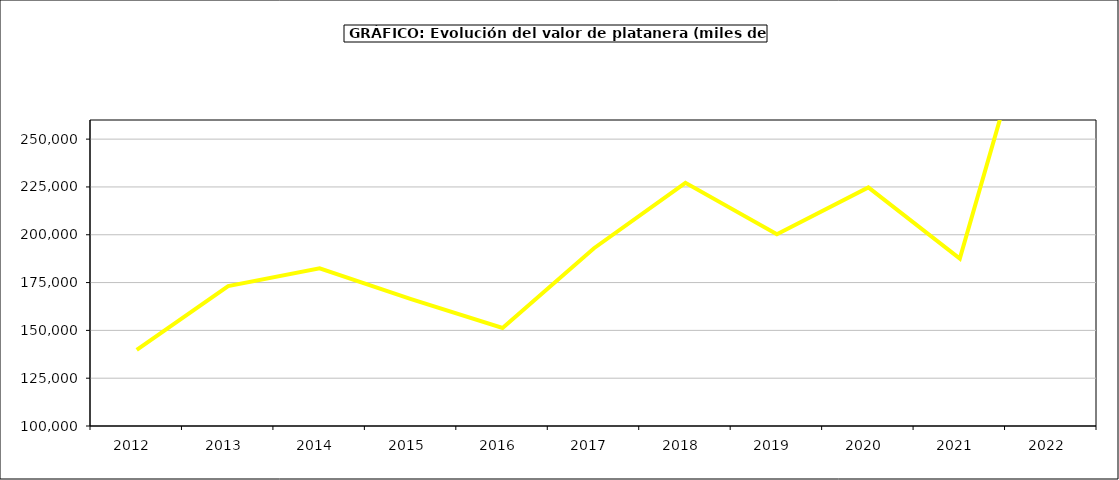
| Category | valor platanera |
|---|---|
| 2012.0 | 139816.382 |
| 2013.0 | 173165.464 |
| 2014.0 | 182466.749 |
| 2015.0 | 166392 |
| 2016.0 | 151266 |
| 2017.0 | 192961.354 |
| 2018.0 | 227178.133 |
| 2019.0 | 200278.061 |
| 2020.0 | 224777.04 |
| 2021.0 | 187534.19 |
| 2022.0 | 353479.137 |